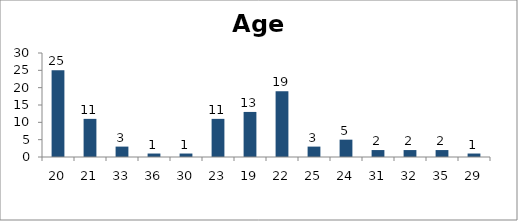
| Category | Age |
|---|---|
| 20.0 | 25 |
| 21.0 | 11 |
| 33.0 | 3 |
| 36.0 | 1 |
| 30.0 | 1 |
| 23.0 | 11 |
| 19.0 | 13 |
| 22.0 | 19 |
| 25.0 | 3 |
| 24.0 | 5 |
| 31.0 | 2 |
| 32.0 | 2 |
| 35.0 | 2 |
| 29.0 | 1 |